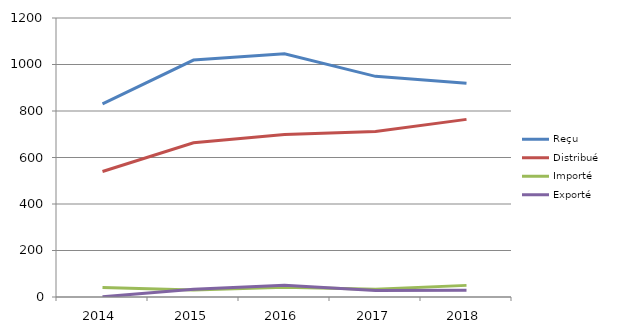
| Category | Reçu | Distribué | Importé | Exporté |
|---|---|---|---|---|
| 2014.0 | 831 | 540 | 41 | 1 |
| 2015.0 | 1019 | 663 | 30 | 33 |
| 2016.0 | 1046 | 699 | 42 | 51 |
| 2017.0 | 949 | 712 | 33 | 28 |
| 2018.0 | 919 | 764 | 50 | 29 |